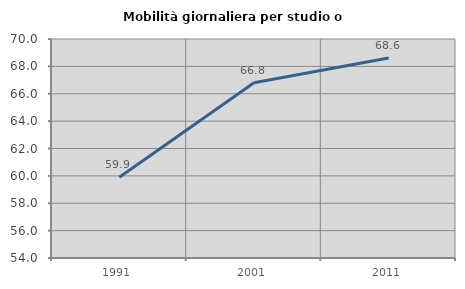
| Category | Mobilità giornaliera per studio o lavoro |
|---|---|
| 1991.0 | 59.895 |
| 2001.0 | 66.798 |
| 2011.0 | 68.611 |